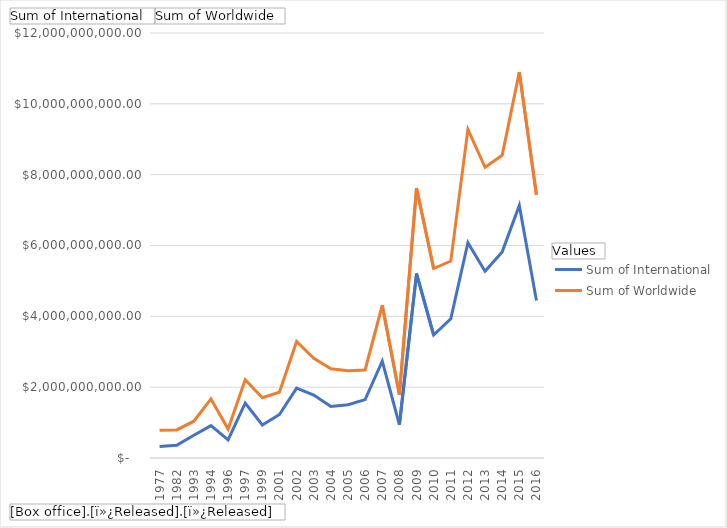
| Category | Sum of International | Sum of Worldwide |
|---|---|---|
| 1977 | 325600000 | 786598007 |
| 1982 | 357854772 | 792965326 |
| 1993 | 643104279 | 1038812584 |
| 1994 | 914406026 | 1667337304 |
| 1996 | 511231623 | 817400878 |
| 1997 | 1548943366 | 2207615668 |
| 1999 | 931800000 | 1699850969 |
| 2001 | 1228852759 | 1861973059 |
| 2002 | 1973164824 | 3292084803 |
| 2003 | 1776486002 | 2816414966 |
| 2004 | 1453111998 | 2517401682 |
| 2005 | 1504454957 | 2466449527 |
| 2006 | 1649752982 | 2485935553 |
| 2007 | 2732921588 | 4312843191 |
| 2008 | 939080294 | 1789449503 |
| 2009 | 5205840749 | 7622733111 |
| 2010 | 3473500533 | 5350524561 |
| 2011 | 3929536729 | 5559936465 |
| 2012 | 6080004709 | 9277887471 |
| 2013 | 5274532311 | 8207669281 |
| 2014 | 5819984385 | 8547872310 |
| 2015 | 7128028520 | 10896275468 |
| 2016 | 4444781839 | 7429959210 |